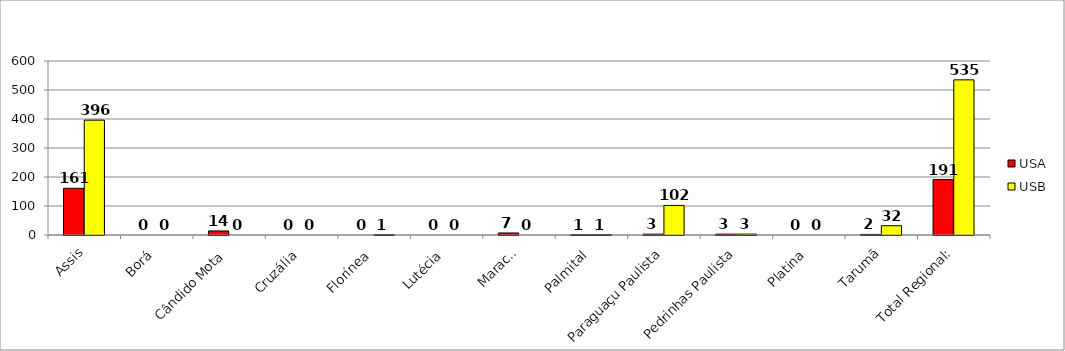
| Category | USA | USB |
|---|---|---|
| Assis | 161 | 396 |
| Borá | 0 | 0 |
| Cândido Mota | 14 | 0 |
| Cruzália | 0 | 0 |
| Florínea | 0 | 1 |
| Lutécia | 0 | 0 |
| Maracaí | 7 | 0 |
| Palmital | 1 | 1 |
| Paraguaçu Paulista | 3 | 102 |
| Pedrinhas Paulista | 3 | 3 |
| Platina | 0 | 0 |
| Tarumã | 2 | 32 |
| Total Regional: | 191 | 535 |